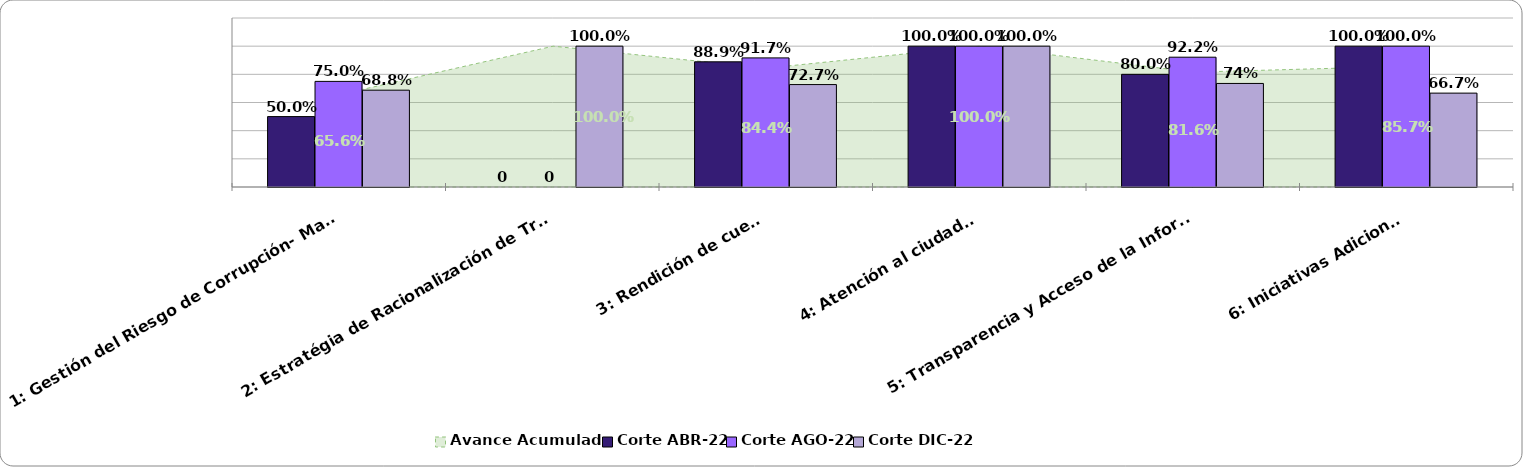
| Category | Corte ABR-22 | Corte AGO-22 | Corte DIC-22 |
|---|---|---|---|
| 1: Gestión del Riesgo de Corrupción- Mapa de Riesgos de Corrupción | 0.5 | 0.75 | 0.688 |
| 2: Estratégia de Racionalización de Trámites | 0 | 0 | 1 |
| 3: Rendición de cuentas | 0.889 | 0.917 | 0.727 |
| 4: Atención al ciudadano | 1 | 1 | 1 |
| 5: Transparencia y Acceso de la Información | 0.8 | 0.922 | 0.735 |
| 6: Iniciativas Adicionales  | 1 | 1 | 0.667 |